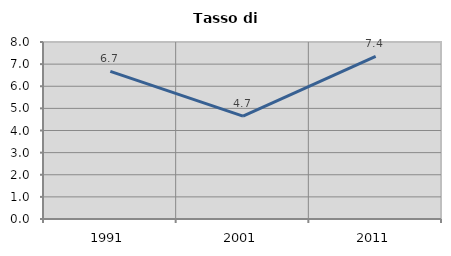
| Category | Tasso di disoccupazione   |
|---|---|
| 1991.0 | 6.673 |
| 2001.0 | 4.652 |
| 2011.0 | 7.355 |